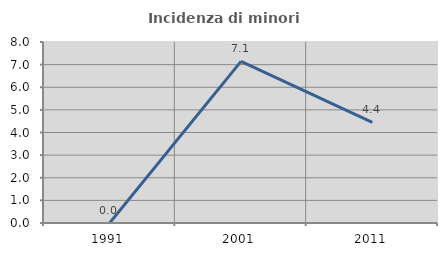
| Category | Incidenza di minori stranieri |
|---|---|
| 1991.0 | 0 |
| 2001.0 | 7.143 |
| 2011.0 | 4.444 |